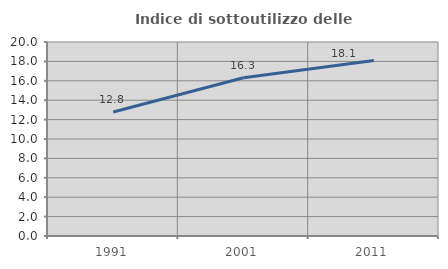
| Category | Indice di sottoutilizzo delle abitazioni  |
|---|---|
| 1991.0 | 12.778 |
| 2001.0 | 16.321 |
| 2011.0 | 18.1 |